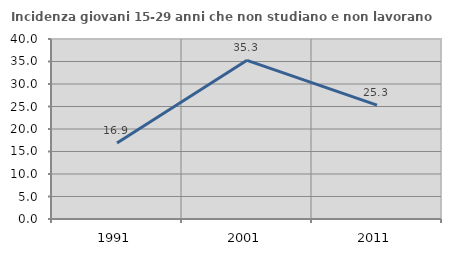
| Category | Incidenza giovani 15-29 anni che non studiano e non lavorano  |
|---|---|
| 1991.0 | 16.87 |
| 2001.0 | 35.258 |
| 2011.0 | 25.301 |